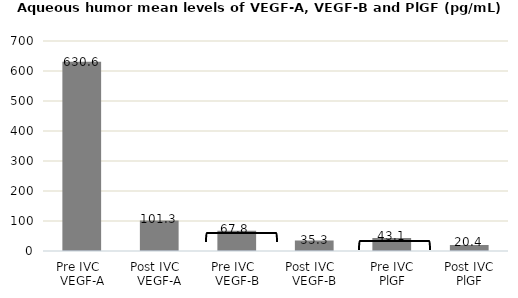
| Category | Aqueous humor levels of VEGF-A, VEGF-B and PlGF |
|---|---|
| Pre IVC   VEGF-A | 630.6 |
| Post IVC   VEGF-A | 101.3 |
| Pre IVC   VEGF-B | 67.8 |
| Post IVC   VEGF-B | 35.3 |
| Pre IVC PlGF | 43.1 |
| Post IVC PlGF | 20.4 |